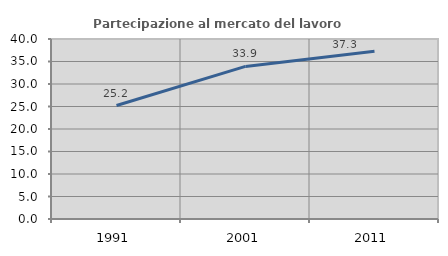
| Category | Partecipazione al mercato del lavoro  femminile |
|---|---|
| 1991.0 | 25.21 |
| 2001.0 | 33.913 |
| 2011.0 | 37.273 |